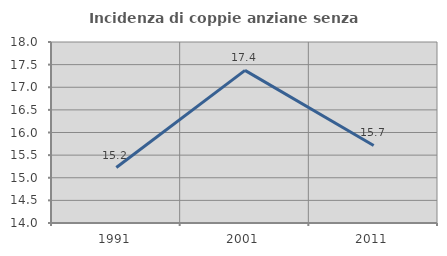
| Category | Incidenza di coppie anziane senza figli  |
|---|---|
| 1991.0 | 15.226 |
| 2001.0 | 17.373 |
| 2011.0 | 15.714 |